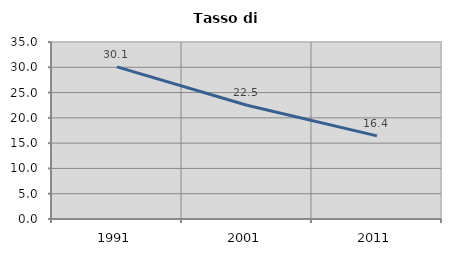
| Category | Tasso di disoccupazione   |
|---|---|
| 1991.0 | 30.074 |
| 2001.0 | 22.496 |
| 2011.0 | 16.436 |